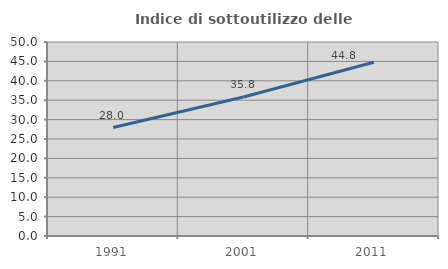
| Category | Indice di sottoutilizzo delle abitazioni  |
|---|---|
| 1991.0 | 27.952 |
| 2001.0 | 35.817 |
| 2011.0 | 44.787 |